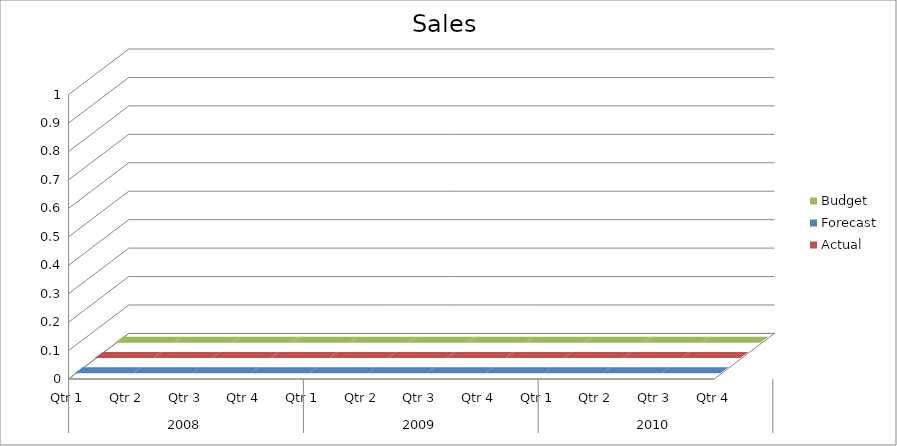
| Category | Budget | Forecast | Actual |
|---|---|---|---|
| 0 | 2320 | 3170 | 2180 |
| 1 | 3350 | 3430 | 1070 |
| 2 | 3180 | 3120 | 2500 |
| 3 | 3050 | 1750 | 3490 |
| 4 | 1970 | 3290 | 540 |
| 5 | 1660 | 2220 | 2240 |
| 6 | 1020 | 3490 | 900 |
| 7 | 2830 | 980 | 2880 |
| 8 | 2520 | 860 | 690 |
| 9 | 1820 | 2550 | 2030 |
| 10 | 1270 | 2230 | 1680 |
| 11 | 2350 | 1500 | 2500 |